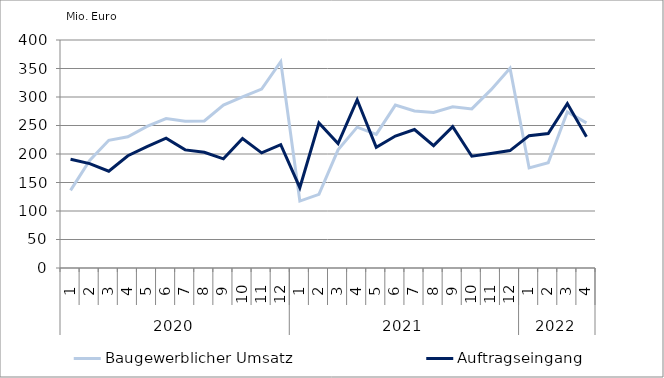
| Category | Baugewerblicher Umsatz | Auftragseingang |
|---|---|---|
| 0 | 136135.432 | 190647.086 |
| 1 | 188682.361 | 183141.14 |
| 2 | 224009.315 | 169770.009 |
| 3 | 230172.252 | 196979.845 |
| 4 | 248410.714 | 212955.83 |
| 5 | 262078.128 | 227853.487 |
| 6 | 257360.37 | 207209.188 |
| 7 | 257932.168 | 202976.091 |
| 8 | 285866.269 | 191463.844 |
| 9 | 300164.57 | 227245.467 |
| 10 | 313922.518 | 202060.636 |
| 11 | 362040.738 | 216296.504 |
| 12 | 117421.805 | 141020.655 |
| 13 | 129162.55 | 254416.876 |
| 14 | 207280.837 | 218451.405 |
| 15 | 247094.279 | 295077.868 |
| 16 | 234515.312 | 211696.129 |
| 17 | 285732.845 | 231455.155 |
| 18 | 275480.885 | 242932.505 |
| 19 | 272787.524 | 214636.944 |
| 20 | 282850.254 | 247827.991 |
| 21 | 279173.21 | 196069.238 |
| 22 | 312511.437 | 201015.897 |
| 23 | 350582.01 | 205949.991 |
| 24 | 175456.852 | 232178.255 |
| 25 | 184578.32 | 236006.862 |
| 26 | 273732.567 | 288451.109 |
| 27 | 254683.671 | 230228.968 |